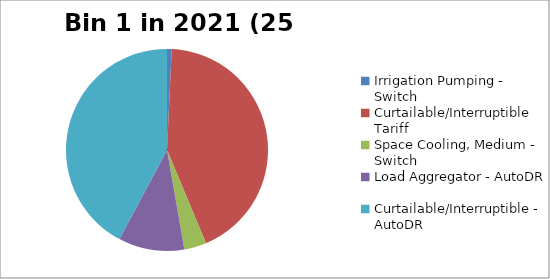
| Category | Series 0 |
|---|---|
| Irrigation Pumping - Switch | 0.003 |
| Curtailable/Interruptible Tariff | 0.151 |
| Space Cooling, Medium - Switch | 0.013 |
| Load Aggregator - AutoDR | 0.037 |
| Curtailable/Interruptible - AutoDR | 0.148 |